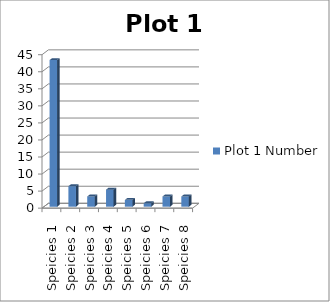
| Category | Plot 1 Number |
|---|---|
| Speicies 1 | 43 |
| Speicies 2 | 6 |
| Speicies 3 | 3 |
| Speicies 4 | 5 |
| Speicies 5 | 2 |
| Speicies 6 | 1 |
| Speicies 7 | 3 |
| Speicies 8 | 3 |